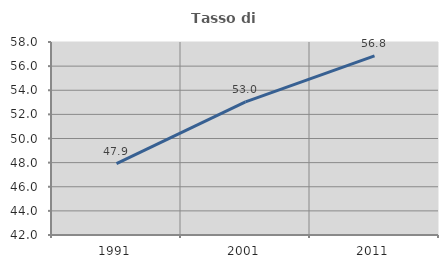
| Category | Tasso di occupazione   |
|---|---|
| 1991.0 | 47.917 |
| 2001.0 | 53.03 |
| 2011.0 | 56.847 |